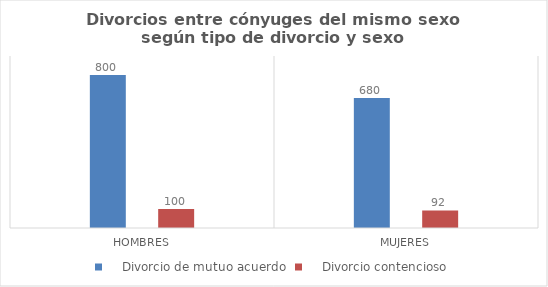
| Category |     Divorcio de mutuo acuerdo |     Divorcio contencioso |
|---|---|---|
| Hombres | 800 | 100 |
| Mujeres | 680 | 92 |